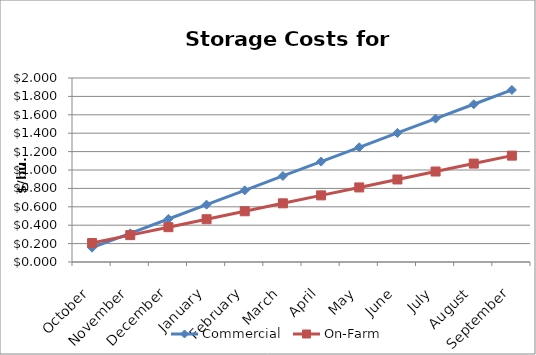
| Category | Commercial | On-Farm |
|---|---|---|
| October | 0.156 | 0.206 |
| November | 0.312 | 0.292 |
| December | 0.468 | 0.379 |
| January | 0.623 | 0.465 |
| February | 0.779 | 0.551 |
| March | 0.935 | 0.638 |
| April | 1.091 | 0.724 |
| May | 1.247 | 0.811 |
| June | 1.403 | 0.897 |
| July | 1.559 | 0.983 |
| August | 1.715 | 1.07 |
| September | 1.87 | 1.156 |